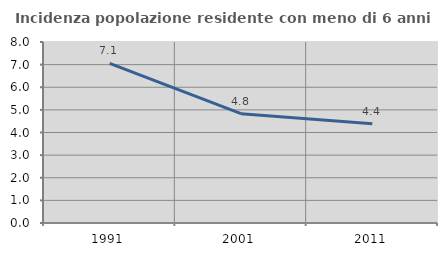
| Category | Incidenza popolazione residente con meno di 6 anni |
|---|---|
| 1991.0 | 7.054 |
| 2001.0 | 4.832 |
| 2011.0 | 4.384 |